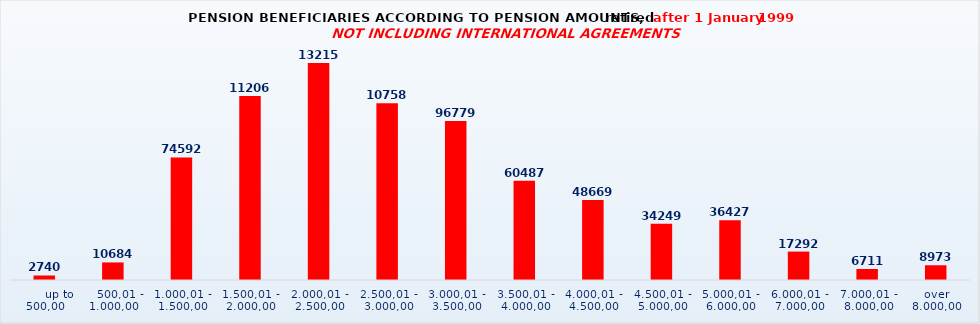
| Category | Series 0 |
|---|---|
|       up to 500,00 | 2740 |
|    500,01 - 1.000,00 | 10684 |
| 1.000,01 - 1.500,00 | 74592 |
| 1.500,01 - 2.000,00 | 112064 |
| 2.000,01 - 2.500,00 | 132156 |
| 2.500,01 - 3.000,00 | 107584 |
| 3.000,01 - 3.500,00 | 96779 |
| 3.500,01 - 4.000,00 | 60487 |
| 4.000,01 - 4.500,00 | 48669 |
| 4.500,01 - 5.000,00 | 34249 |
| 5.000,01 - 6.000,00 | 36427 |
| 6.000,01 - 7.000,00 | 17292 |
| 7.000,01 - 8.000,00 | 6711 |
| over 8.000,00 | 8973 |